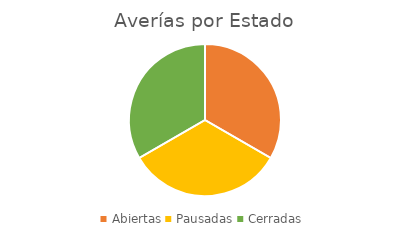
| Category | Series 0 |
|---|---|
| Abiertas | 1 |
| Pausadas | 1 |
| Cerradas | 1 |